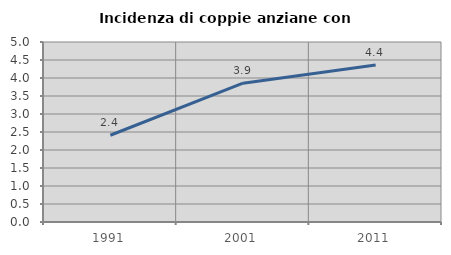
| Category | Incidenza di coppie anziane con figli |
|---|---|
| 1991.0 | 2.41 |
| 2001.0 | 3.856 |
| 2011.0 | 4.361 |